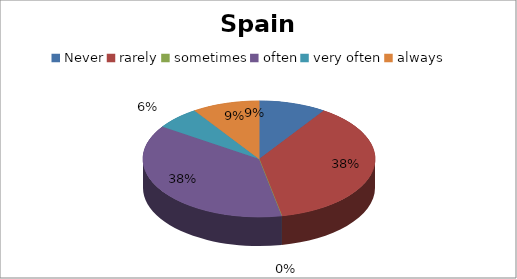
| Category | Series 0 |
|---|---|
| Never | 3 |
| rarely | 12 |
| sometimes | 0 |
| often | 12 |
| very often | 2 |
| always | 3 |